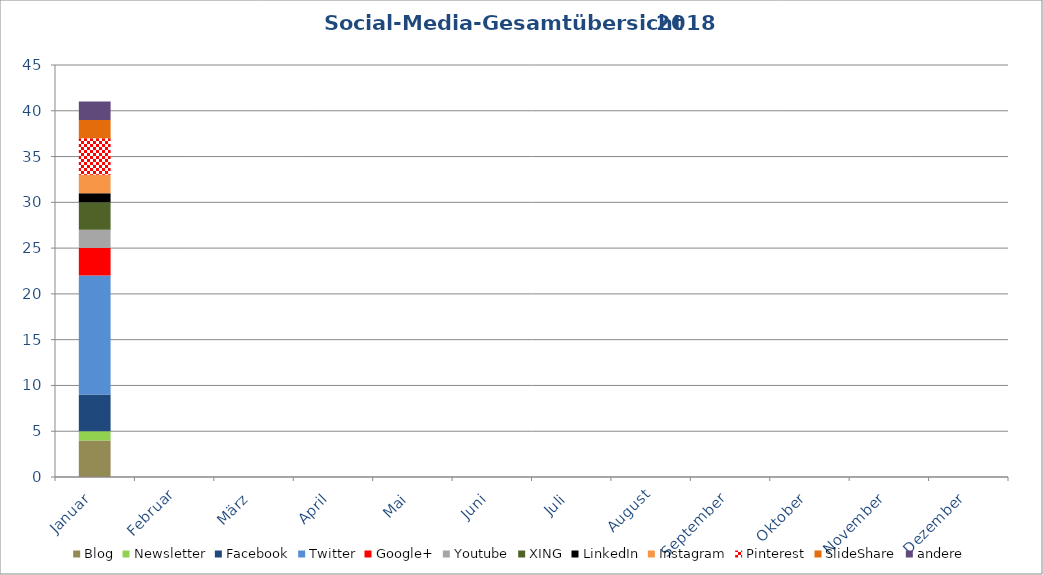
| Category | Blog | Newsletter | Facebook | Twitter | Google+ | Youtube | XING | LinkedIn | Instagram | Pinterest | SlideShare | andere |
|---|---|---|---|---|---|---|---|---|---|---|---|---|
| Januar | 4 | 1 | 4 | 13 | 3 | 2 | 3 | 1 | 2 | 4 | 2 | 2 |
| Februar | 0 | 0 | 0 | 0 | 0 | 0 | 0 | 0 | 0 | 0 | 0 | 0 |
| März | 0 | 0 | 0 | 0 | 0 | 0 | 0 | 0 | 0 | 0 | 0 | 0 |
| April | 0 | 0 | 0 | 0 | 0 | 0 | 0 | 0 | 0 | 0 | 0 | 0 |
| Mai | 0 | 0 | 0 | 0 | 0 | 0 | 0 | 0 | 0 | 0 | 0 | 0 |
| Juni | 0 | 0 | 0 | 0 | 0 | 0 | 0 | 0 | 0 | 0 | 0 | 0 |
| Juli | 0 | 0 | 0 | 0 | 0 | 0 | 0 | 0 | 0 | 0 | 0 | 0 |
| August | 0 | 0 | 0 | 0 | 0 | 0 | 0 | 0 | 0 | 0 | 0 | 0 |
| September | 0 | 0 | 0 | 0 | 0 | 0 | 0 | 0 | 0 | 0 | 0 | 0 |
| Oktober | 0 | 0 | 0 | 0 | 0 | 0 | 0 | 0 | 0 | 0 | 0 | 0 |
| November | 0 | 0 | 0 | 0 | 0 | 0 | 0 | 0 | 0 | 0 | 0 | 0 |
| Dezember | 0 | 0 | 0 | 0 | 0 | 0 | 0 | 0 | 0 | 0 | 0 | 0 |